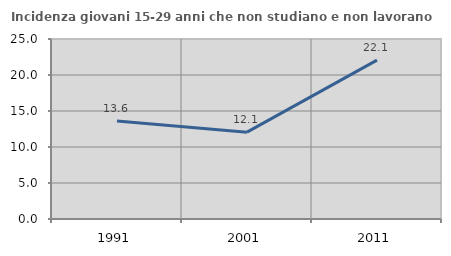
| Category | Incidenza giovani 15-29 anni che non studiano e non lavorano  |
|---|---|
| 1991.0 | 13.624 |
| 2001.0 | 12.06 |
| 2011.0 | 22.069 |